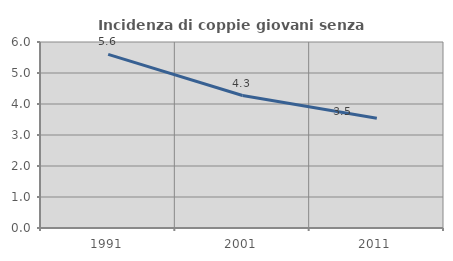
| Category | Incidenza di coppie giovani senza figli |
|---|---|
| 1991.0 | 5.601 |
| 2001.0 | 4.273 |
| 2011.0 | 3.538 |